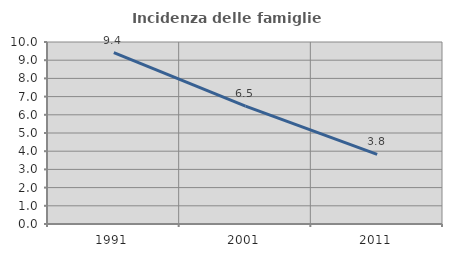
| Category | Incidenza delle famiglie numerose |
|---|---|
| 1991.0 | 9.414 |
| 2001.0 | 6.479 |
| 2011.0 | 3.823 |